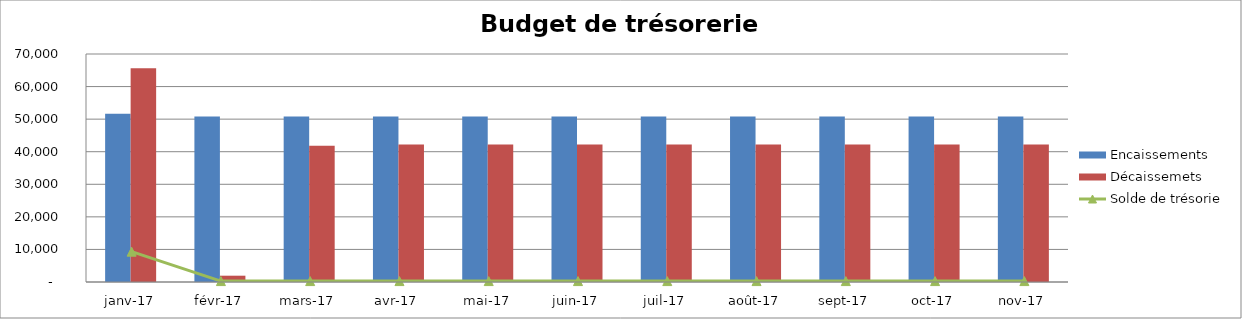
| Category | Encaissements | Décaissemets |
|---|---|---|
| janv-17 | 51640 | 65600 |
| févr-17 | 50794.8 | 1934.917 |
| mars-17 | 50794.8 | 41805.85 |
| avr-17 | 50794.8 | 42206.667 |
| mai-17 | 50794.8 | 42206.667 |
| juin-17 | 50794.8 | 42206.667 |
| juil-17 | 50794.8 | 42206.667 |
| août-17 | 50794.8 | 42206.667 |
| sept-17 | 50794.8 | 42206.667 |
| oct-17 | 50794.8 | 42206.667 |
| nov-17 | 50794.8 | 42206.667 |